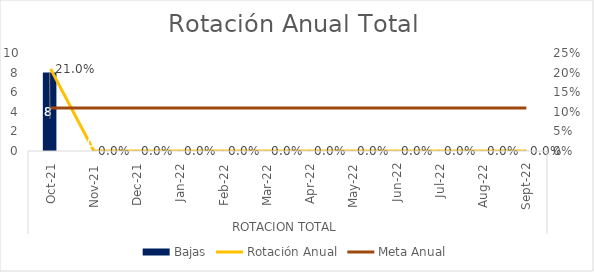
| Category | Bajas |
|---|---|
| 0 | 8 |
| 1 | 0 |
| 2 | 0 |
| 3 | 0 |
| 4 | 0 |
| 5 | 0 |
| 6 | 0 |
| 7 | 0 |
| 8 | 0 |
| 9 | 0 |
| 10 | 0 |
| 11 | 0 |